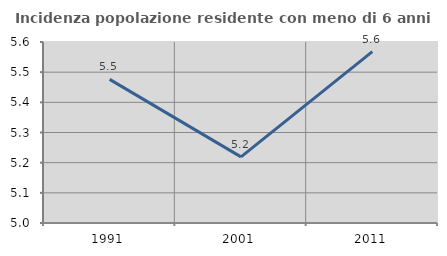
| Category | Incidenza popolazione residente con meno di 6 anni |
|---|---|
| 1991.0 | 5.476 |
| 2001.0 | 5.219 |
| 2011.0 | 5.568 |